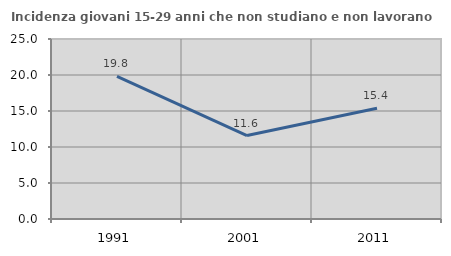
| Category | Incidenza giovani 15-29 anni che non studiano e non lavorano  |
|---|---|
| 1991.0 | 19.797 |
| 2001.0 | 11.594 |
| 2011.0 | 15.385 |